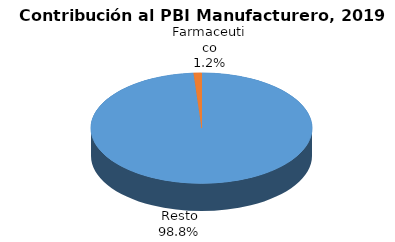
| Category | Series 0 |
|---|---|
| Resto | 69286 |
| Farmaceutico | 812 |